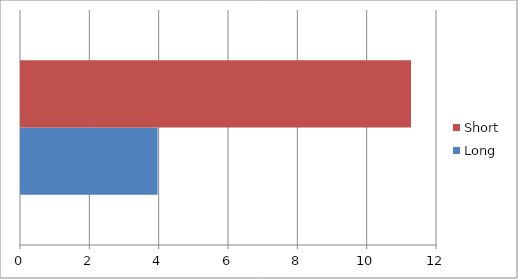
| Category | Long | Short |
|---|---|---|
| 0 | 3.94 | 11.25 |